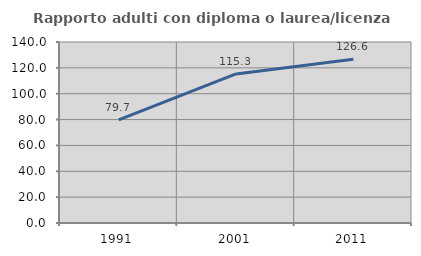
| Category | Rapporto adulti con diploma o laurea/licenza media  |
|---|---|
| 1991.0 | 79.742 |
| 2001.0 | 115.292 |
| 2011.0 | 126.601 |